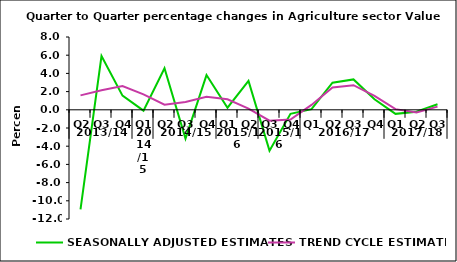
| Category | SEASONALLY ADJUSTED ESTIMATES | TREND CYCLE ESTIMATES |
|---|---|---|
| 0 | -10.932 | 1.582 |
| 1 | 5.905 | 2.141 |
| 2 | 1.554 | 2.601 |
| 3 | -0.092 | 1.692 |
| 4 | 4.557 | 0.564 |
| 5 | -3.169 | 0.861 |
| 6 | 3.816 | 1.439 |
| 7 | 0.228 | 1.151 |
| 8 | 3.169 | 0.13 |
| 9 | -4.487 | -1.189 |
| 10 | -0.435 | -1.068 |
| 11 | 0.069 | 0.537 |
| 12 | 2.985 | 2.453 |
| 13 | 3.339 | 2.707 |
| 14 | 1.151 | 1.527 |
| 15 | -0.446 | 0.071 |
| 16 | -0.212 | -0.294 |
| 17 | 0.603 | 0.346 |